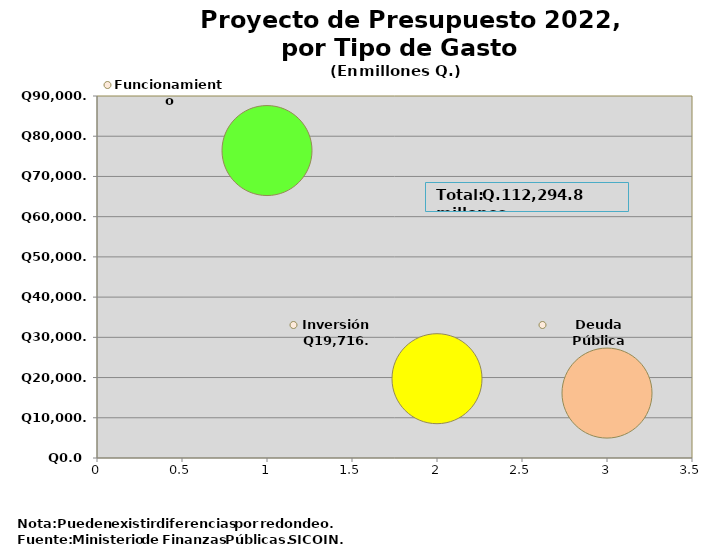
| Category | Recomendado 2022 |
|---|---|
| 0 | 76437 |
| 1 | 19716.1 |
| 2 | 16141.7 |